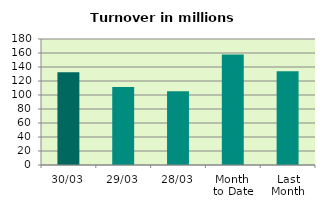
| Category | Series 0 |
|---|---|
| 30/03 | 132.605 |
| 29/03 | 111.524 |
| 28/03 | 105.517 |
| Month 
to Date | 157.812 |
| Last
Month | 133.846 |